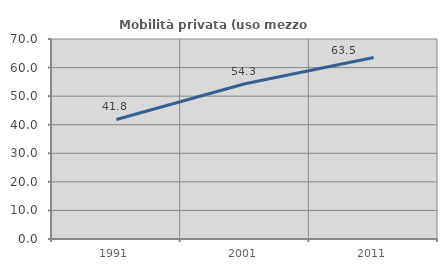
| Category | Mobilità privata (uso mezzo privato) |
|---|---|
| 1991.0 | 41.84 |
| 2001.0 | 54.339 |
| 2011.0 | 63.512 |